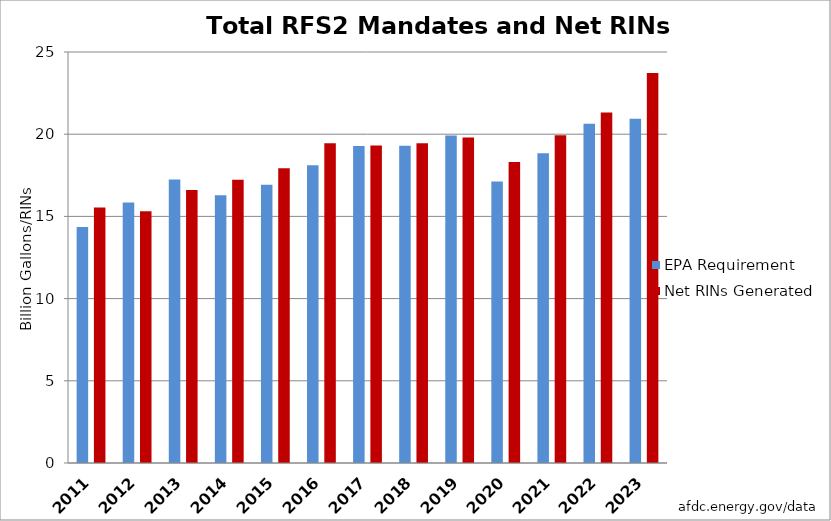
| Category | EPA Requirement | Net RINs Generated |
|---|---|---|
| 2011.0 | 14.362 | 15.547 |
| 2012.0 | 15.843 | 15.306 |
| 2013.0 | 17.245 | 16.609 |
| 2014.0 | 16.28 | 17.224 |
| 2015.0 | 16.93 | 17.922 |
| 2016.0 | 18.11 | 19.449 |
| 2017.0 | 19.28 | 19.316 |
| 2018.0 | 19.29 | 19.448 |
| 2019.0 | 19.92 | 19.796 |
| 2020.0 | 17.13 | 18.315 |
| 2021.0 | 18.84 | 19.934 |
| 2022.0 | 20.63 | 21.316 |
| 2023.0 | 20.94 | 23.725 |